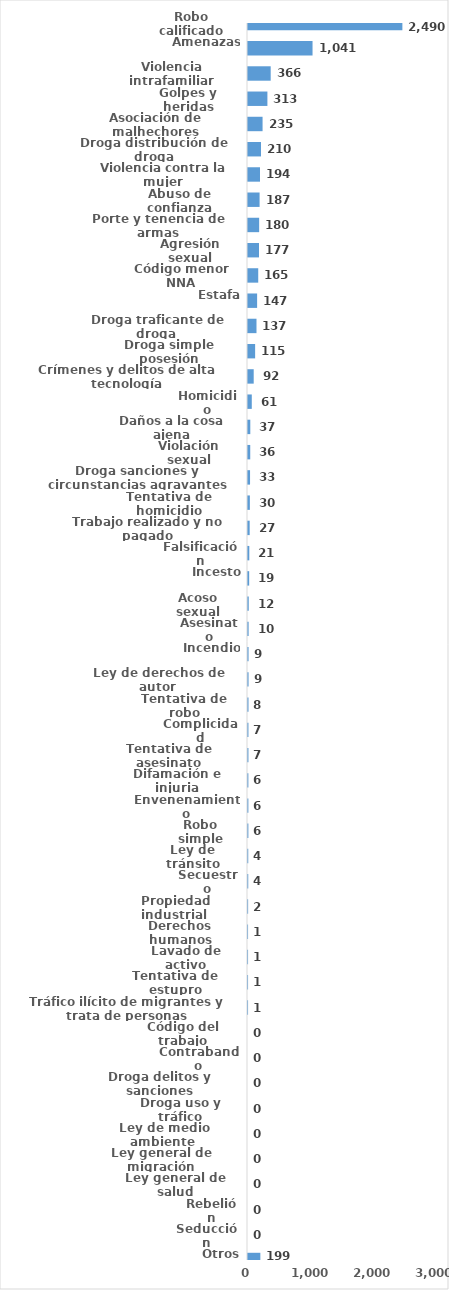
| Category | Series 0 |
|---|---|
| Robo calificado | 2490 |
| Amenazas | 1041 |
| Violencia intrafamiliar | 366 |
| Golpes y heridas | 313 |
| Asociación de malhechores | 235 |
| Droga distribución de droga | 210 |
| Violencia contra la mujer | 194 |
| Abuso de confianza | 187 |
| Porte y tenencia de armas | 180 |
| Agresión sexual | 177 |
| Código menor NNA | 165 |
| Estafa | 147 |
| Droga traficante de droga  | 137 |
| Droga simple posesión | 115 |
| Crímenes y delitos de alta tecnología | 92 |
| Homicidio | 61 |
| Daños a la cosa ajena | 37 |
| Violación sexual | 36 |
| Droga sanciones y circunstancias agravantes | 33 |
| Tentativa de homicidio | 30 |
| Trabajo realizado y no pagado | 27 |
| Falsificación | 21 |
| Incesto | 19 |
| Acoso sexual | 12 |
| Asesinato | 10 |
| Incendio | 9 |
| Ley de derechos de autor  | 9 |
| Tentativa de robo | 8 |
| Complicidad | 7 |
| Tentativa de asesinato | 7 |
| Difamación e injuria | 6 |
| Envenenamiento | 6 |
| Robo simple | 6 |
| Ley de tránsito | 4 |
| Secuestro | 4 |
| Propiedad industrial  | 2 |
| Derechos humanos | 1 |
| Lavado de activo | 1 |
| Tentativa de estupro | 1 |
| Tráfico ilícito de migrantes y trata de personas | 1 |
| Código del trabajo | 0 |
| Contrabando | 0 |
| Droga delitos y sanciones | 0 |
| Droga uso y tráfico | 0 |
| Ley de medio ambiente  | 0 |
| Ley general de migración | 0 |
| Ley general de salud | 0 |
| Rebelión | 0 |
| Seducción | 0 |
| Otros | 199 |